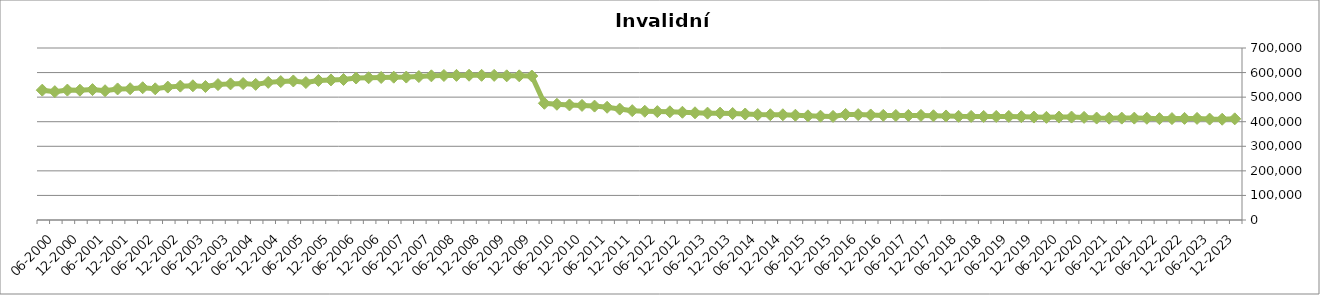
| Category | Invalidní důchodci |
|---|---|
| 12-2023 | 411706 |
| 09-2023 | 410149 |
| 06-2023 | 410668 |
| 03-2023 | 413465 |
| 12-2022 | 413513 |
| 09-2022 | 412747 |
| 06-2022 | 412424 |
| 03-2022 | 414028 |
| 12-2021 | 414646 |
| 09-2021 | 414628 |
| 06-2021 | 414275 |
| 03-2021 | 414913 |
| 12-2020 | 417639 |
| 09-2020 | 418942 |
| 06-2020 | 418881 |
| 03-2020 | 417816 |
| 12-2019 | 418983 |
| 09-2019 | 420544 |
| 06-2019 | 421368 |
| 03-2019 | 421317 |
| 12-2018 | 421487 |
| 09-2018 | 421631 |
| 06-2018 | 421896 |
| 03-2018 | 423428 |
| 12-2017 | 424242 |
| 09-2017 | 425611 |
| 06-2017 | 425363 |
| 03-2017 | 425318 |
| 12-2016 | 425788 |
| 09-2016 | 427431 |
| 06-2016 | 428887 |
| 03-2016 | 429630 |
| 12-2015 | 421655 |
| 09-2015 | 422445 |
| 06-2015 | 423981 |
| 03-2015 | 426338 |
| 12-2014 | 428298 |
| 09-2014 | 428413 |
| 06-2014 | 429217 |
| 03-2014 | 431378 |
| 12-2013 | 433414 |
| 09-2013 | 434902 |
| 06-2013 | 434895 |
| 03-2013 | 436409 |
| 12-2012 | 438509 |
| 09-2012 | 440421 |
| 06-2012 | 441142 |
| 03-2012 | 442543 |
| 12-2011 | 445033 |
| 09-2011 | 451409 |
| 06-2011 | 458844 |
| 03-2011 | 463556 |
| 12-2010 | 466329 |
| 09-2010 | 468267 |
| 06-2010 | 470958 |
| 03-2010 | 474991 |
| 12-2009 | 585944 |
| 09-2009 | 586867 |
| 06-2009 | 586864 |
| 03-2009 | 588540 |
| 12-2008 | 588745 |
| 09-2008 | 589247 |
| 06-2008 | 588585 |
| 03-2008 | 588112 |
| 12-2007 | 586686 |
| 09-2007 | 583756 |
| 06-2007 | 581694 |
| 03-2007 | 581173 |
| 12-2006 | 580055 |
| 09-2006 | 578862 |
| 06-2006 | 577813 |
| 03-2006 | 571789 |
| 12-2005 | 570055 |
| 09-2005 | 567797 |
| 06-2005 | 559501 |
| 03-2005 | 565866 |
| 12-2004 | 563376 |
| 09-2004 | 560131 |
| 06-2004 | 551916 |
| 03-2004 | 555295 |
| 12-2003 | 553985 |
| 09-2003 | 551109 |
| 06-2003 | 543257 |
| 03-2003 | 546198 |
| 12-2002 | 544838 |
| 09-2002 | 540927 |
| 06-2002 | 533907 |
| 03-2002 | 538230 |
| 12-2001 | 534287 |
| 09-2001 | 533388 |
| 06-2001 | 526095 |
| 03-2001 | 530752 |
| 12-2000 | 528288 |
| 09-2000 | 528692 |
| 06-2000 | 522380 |
| 03-2000 | 528445 |